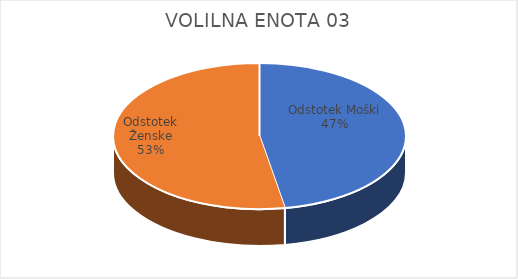
| Category | VOLILNA ENOTA 03 | #REF! | Slovenija skupaj |
|---|---|---|---|
| Odstotek Moški | 26.51 |  | 25.26 |
| Odstotek Ženske | 29.62 |  | 26.62 |